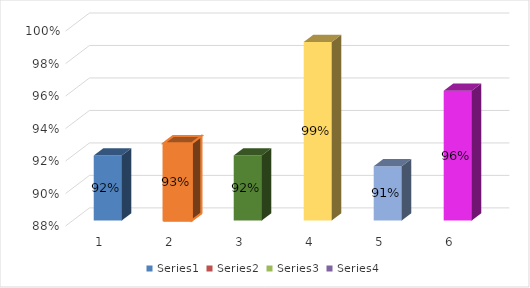
| Category | Series 0 | Series 1 | Series 2 | Series 3 |
|---|---|---|---|---|
| 0 | 0.92 |  |  |  |
| 1 | 0.928 |  |  |  |
| 2 | 0.92 |  |  |  |
| 3 | 0.99 |  |  |  |
| 4 | 0.913 |  |  |  |
| 5 | 0.96 |  |  |  |